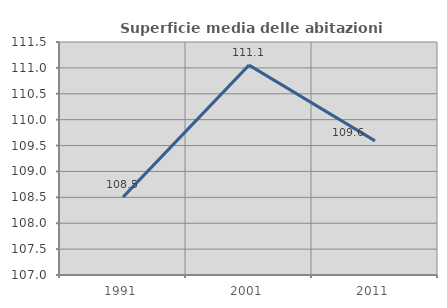
| Category | Superficie media delle abitazioni occupate |
|---|---|
| 1991.0 | 108.504 |
| 2001.0 | 111.053 |
| 2011.0 | 109.591 |